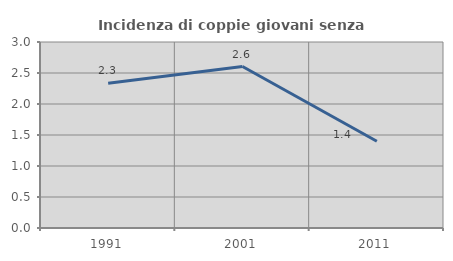
| Category | Incidenza di coppie giovani senza figli |
|---|---|
| 1991.0 | 2.336 |
| 2001.0 | 2.604 |
| 2011.0 | 1.399 |